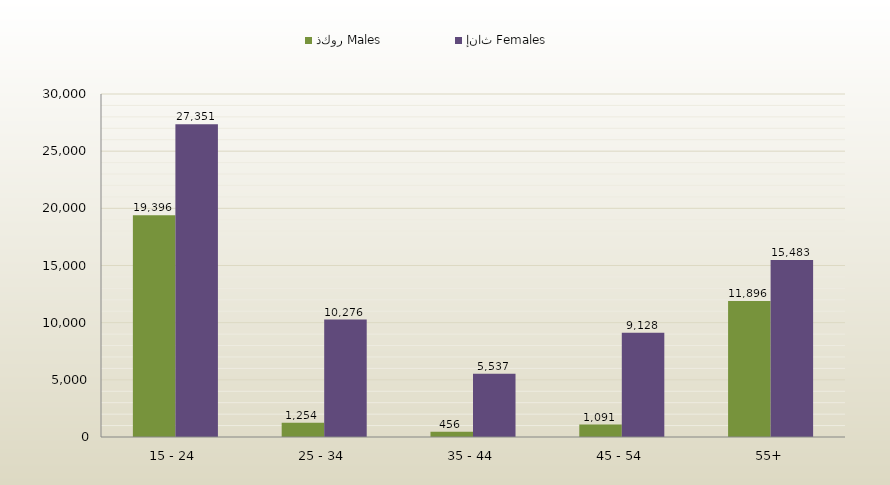
| Category | ذكور Males | إناث Females |
|---|---|---|
| 15 - 24 | 19396 | 27351 |
| 25 - 34 | 1254 | 10276 |
| 35 - 44 | 456 | 5537 |
| 45 - 54 | 1091 | 9128 |
| 55+ | 11896 | 15483 |